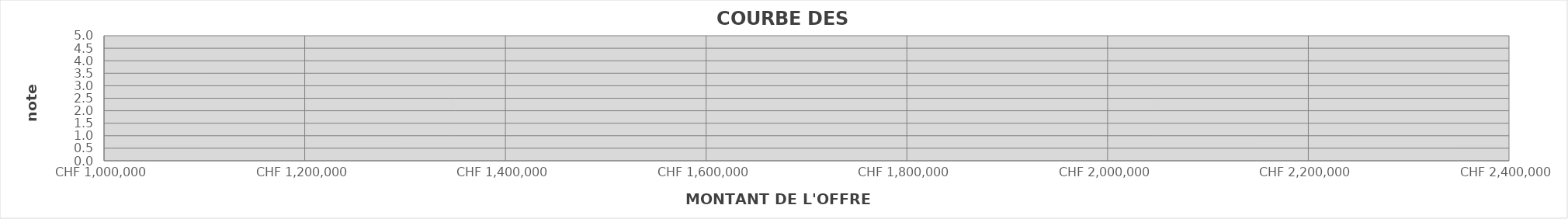
| Category | NOTE FINALE  |
|---|---|
|  | 0 |
|  | 0 |
|  | 0 |
|  | 0 |
|  | 0 |
|  | 0 |
|  | 0 |
|  | 0 |
|  | 0 |
|  | 0 |
|  | 0 |
|  | 0 |
|  | 0 |
|  | 0 |
|  | 0 |